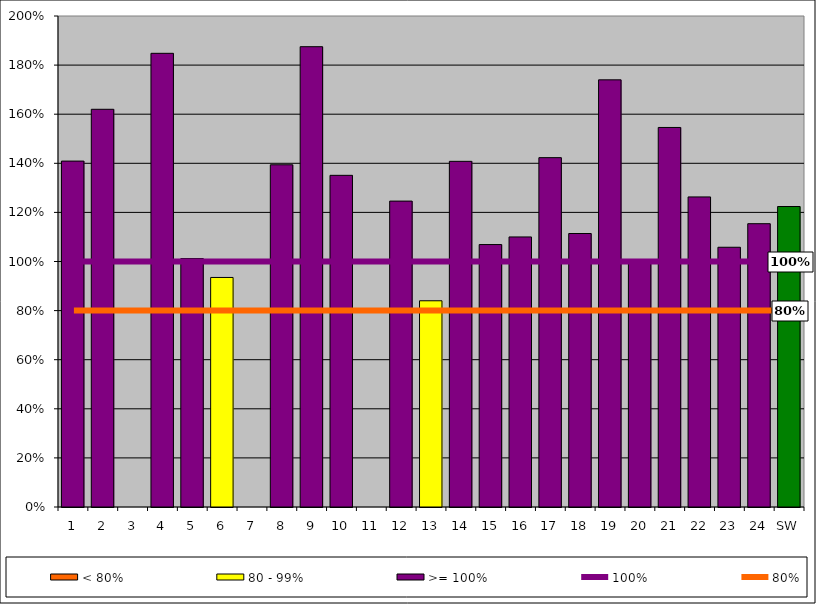
| Category | < 80% | 80 - 99% | >= 100% |
|---|---|---|---|
| 1 | 0 | 0 | 1.409 |
| 2 | 0 | 0 | 1.62 |
| 3 | 0 | 0 | 0 |
| 4 | 0 | 0 | 1.848 |
| 5 | 0 | 0 | 1.012 |
| 6 | 0 | 0.935 | 0 |
| 7 | 0 | 0 | 0 |
| 8 | 0 | 0 | 1.394 |
| 9 | 0 | 0 | 1.875 |
| 10 | 0 | 0 | 1.351 |
| 11 | 0 | 0 | 0 |
| 12 | 0 | 0 | 1.246 |
| 13 | 0 | 0.84 | 0 |
| 14 | 0 | 0 | 1.408 |
| 15 | 0 | 0 | 1.069 |
| 16 | 0 | 0 | 1.1 |
| 17 | 0 | 0 | 1.423 |
| 18 | 0 | 0 | 1.114 |
| 19 | 0 | 0 | 1.74 |
| 20 | 0 | 0 | 1.007 |
| 21 | 0 | 0 | 1.546 |
| 22 | 0 | 0 | 1.263 |
| 23 | 0 | 0 | 1.058 |
| 24 | 0 | 0 | 1.154 |
| SW | 0 | 0 | 1.224 |